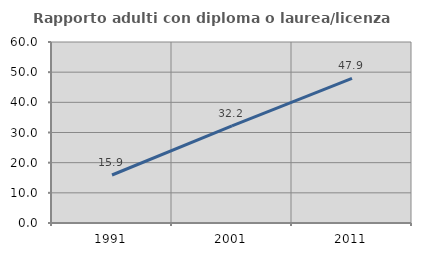
| Category | Rapporto adulti con diploma o laurea/licenza media  |
|---|---|
| 1991.0 | 15.909 |
| 2001.0 | 32.203 |
| 2011.0 | 47.938 |